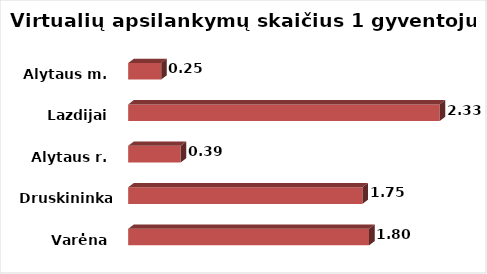
| Category | Series 0 |
|---|---|
| Varėna | 1.805 |
| Druskininkai  | 1.755 |
| Alytaus r. | 0.393 |
| Lazdijai | 2.334 |
| Alytaus m. | 0.247 |